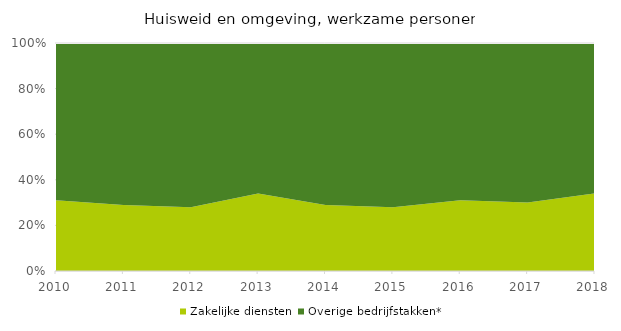
| Category | Zakelijke diensten | Overige bedrijfstakken* |
|---|---|---|
| 2010 | 0.31 | 0.69 |
| 2011 | 0.29 | 0.71 |
| 2012 | 0.28 | 0.72 |
| 2013 | 0.34 | 0.66 |
| 2014 | 0.29 | 0.71 |
| 2015 | 0.28 | 0.72 |
| 2016 | 0.31 | 0.69 |
| 2017 | 0.3 | 0.7 |
| 2018 | 0.34 | 0.66 |